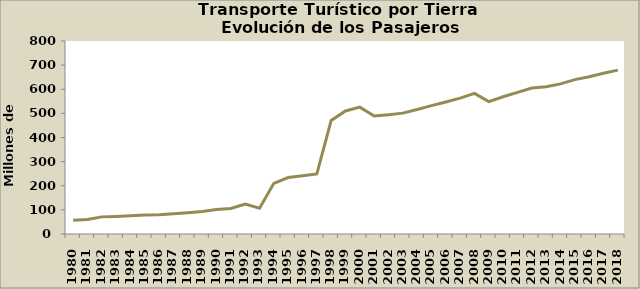
| Category | Series 0 |
|---|---|
| 1980.0 | 57 |
| 1981.0 | 60 |
| 1982.0 | 71 |
| 1983.0 | 73 |
| 1984.0 | 76 |
| 1985.0 | 79 |
| 1986.0 | 80 |
| 1987.0 | 84 |
| 1988.0 | 88 |
| 1989.0 | 93 |
| 1990.0 | 102 |
| 1991.0 | 106 |
| 1992.0 | 124 |
| 1993.0 | 107 |
| 1994.0 | 210 |
| 1995.0 | 234 |
| 1996.0 | 241 |
| 1997.0 | 249 |
| 1998.0 | 471 |
| 1999.0 | 510 |
| 2000.0 | 526 |
| 2001.0 | 489 |
| 2002.0 | 494 |
| 2003.0 | 501 |
| 2004.0 | 516 |
| 2005.0 | 532 |
| 2006.0 | 547 |
| 2007.0 | 563 |
| 2008.0 | 583 |
| 2009.0 | 549 |
| 2010.0 | 569 |
| 2011.0 | 587 |
| 2012.0 | 605 |
| 2013.0 | 610 |
| 2014.0 | 622.205 |
| 2015.0 | 640 |
| 2016.0 | 652.14 |
| 2017.0 | 666.18 |
| 2018.0 | 679.14 |